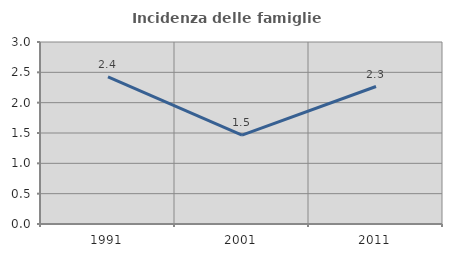
| Category | Incidenza delle famiglie numerose |
|---|---|
| 1991.0 | 2.425 |
| 2001.0 | 1.466 |
| 2011.0 | 2.266 |